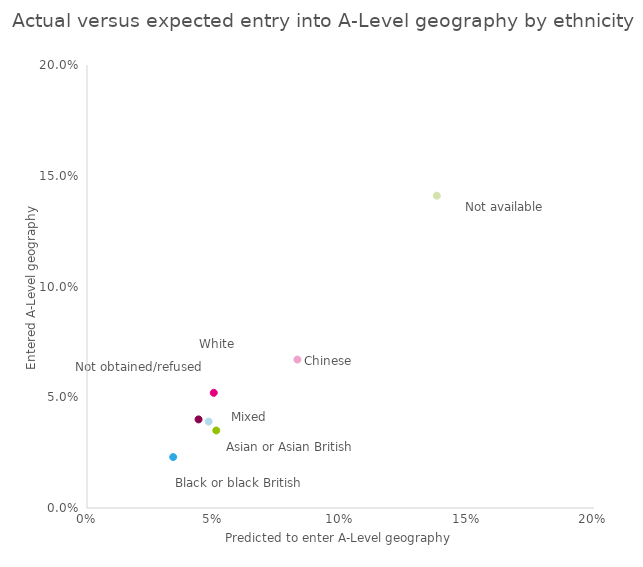
| Category | Series 0 |
|---|---|
| 0.05 | 0.052 |
| 0.034 | 0.023 |
| 0.051 | 0.035 |
| 0.083 | 0.067 |
| 0.048 | 0.039 |
| 0.138 | 0.141 |
| 0.044 | 0.04 |